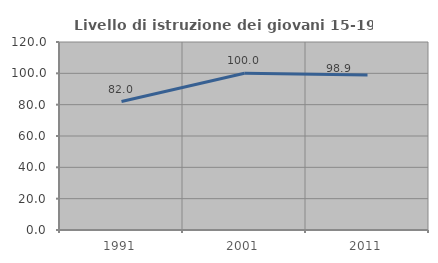
| Category | Livello di istruzione dei giovani 15-19 anni |
|---|---|
| 1991.0 | 82.016 |
| 2001.0 | 100 |
| 2011.0 | 98.864 |